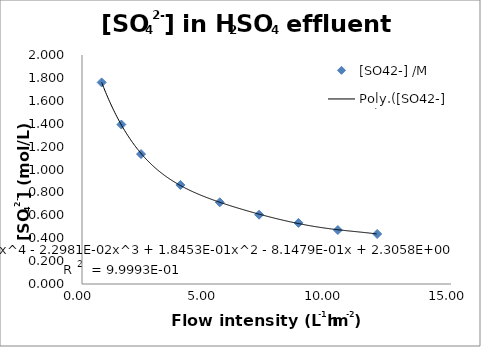
| Category | [SO42-] /M |
|---|---|
| 0.8 | 1.76 |
| 1.6 | 1.393 |
| 2.4 | 1.135 |
| 4.0 | 0.865 |
| 5.6 | 0.714 |
| 7.2 | 0.605 |
| 8.8 | 0.534 |
| 10.4 | 0.471 |
| 12.0 | 0.437 |